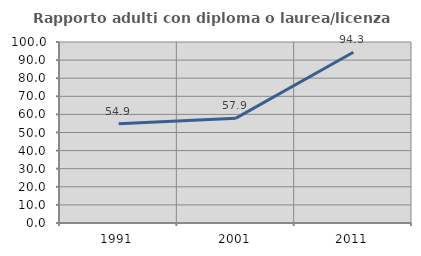
| Category | Rapporto adulti con diploma o laurea/licenza media  |
|---|---|
| 1991.0 | 54.878 |
| 2001.0 | 57.923 |
| 2011.0 | 94.335 |